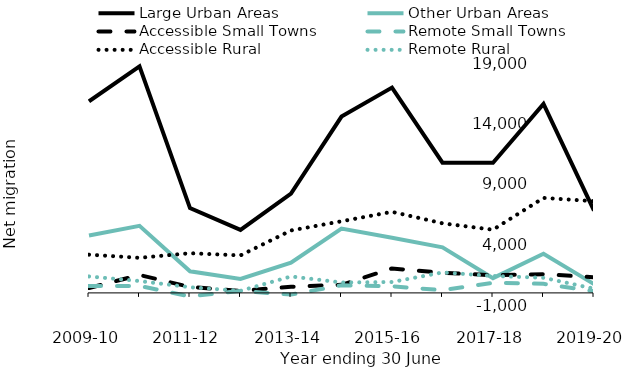
| Category | Large Urban Areas | Other Urban Areas | Accessible Small Towns | Remote Small Towns | Accessible Rural | Remote Rural |
|---|---|---|---|---|---|---|
| 2009-10 | 15830 | 4750 | 400 | 580 | 3160 | 1360 |
| 2010-11 | 18720 | 5540 | 1480 | 580 | 2900 | 980 |
| 2011-12 | 7010 | 1790 | 490 | -290 | 3280 | 470 |
| 2012-13 | 5210 | 1160 | 170 | 160 | 3100 | 170 |
| 2013-14 | 8200 | 2500 | 510 | -140 | 5160 | 1360 |
| 2014-15 | 14570 | 5320 | 670 | 630 | 5920 | 860 |
| 2015-16 | 16970 | 4560 | 2020 | 550 | 6700 | 900 |
| 2016-17 | 10760 | 3770 | 1660 | 220 | 5750 | 1690 |
| 2017-18 | 10750 | 1220 | 1460 | 840 | 5220 | 1400 |
| 2018-19 | 15620 | 3230 | 1550 | 750 | 7850 | 1250 |
| 2019-20 | 6800 | 730 | 1290 | 140 | 7580 | 350 |